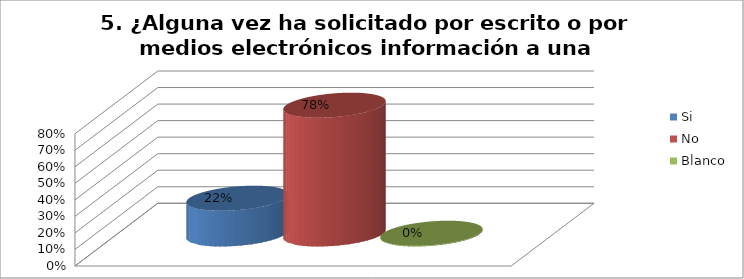
| Category | Si | No | Blanco |
|---|---|---|---|
| 0 | 0.216 | 0.779 | 0.005 |